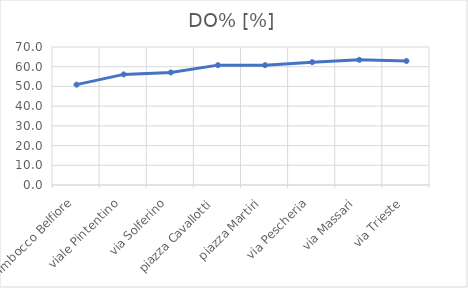
| Category | DO% [%] |
|---|---|
| Imbocco Belfiore | 50.9 |
| viale Pintentino | 56.1 |
| via Solferino | 57.1 |
| piazza Cavallotti | 60.8 |
| piazza Martiri | 60.8 |
| via Pescheria | 62.3 |
| via Massari | 63.5 |
| via Trieste | 62.9 |